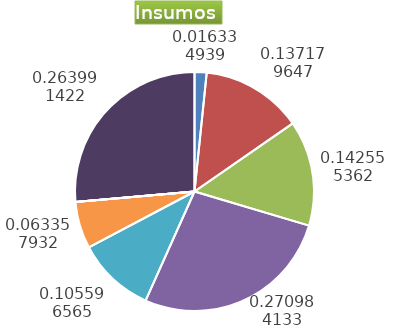
| Category | Series 0 |
|---|---|
| Control arvenses | 272328 |
| Control fitosanitario | 2286991 |
| Cosecha y beneficio | 2376612.266 |
| Fertilización | 4517713 |
| Instalación | 1760453.53 |
| Otros | 1056272 |
| Podas | 0 |
| Riego | 0 |
| Transporte | 0 |
| Tutorado | 4401134 |